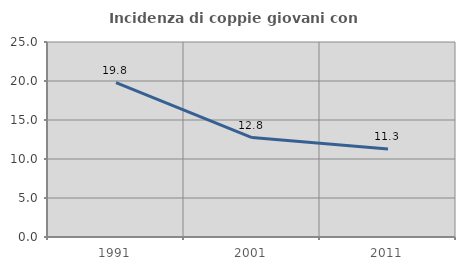
| Category | Incidenza di coppie giovani con figli |
|---|---|
| 1991.0 | 19.799 |
| 2001.0 | 12.753 |
| 2011.0 | 11.269 |